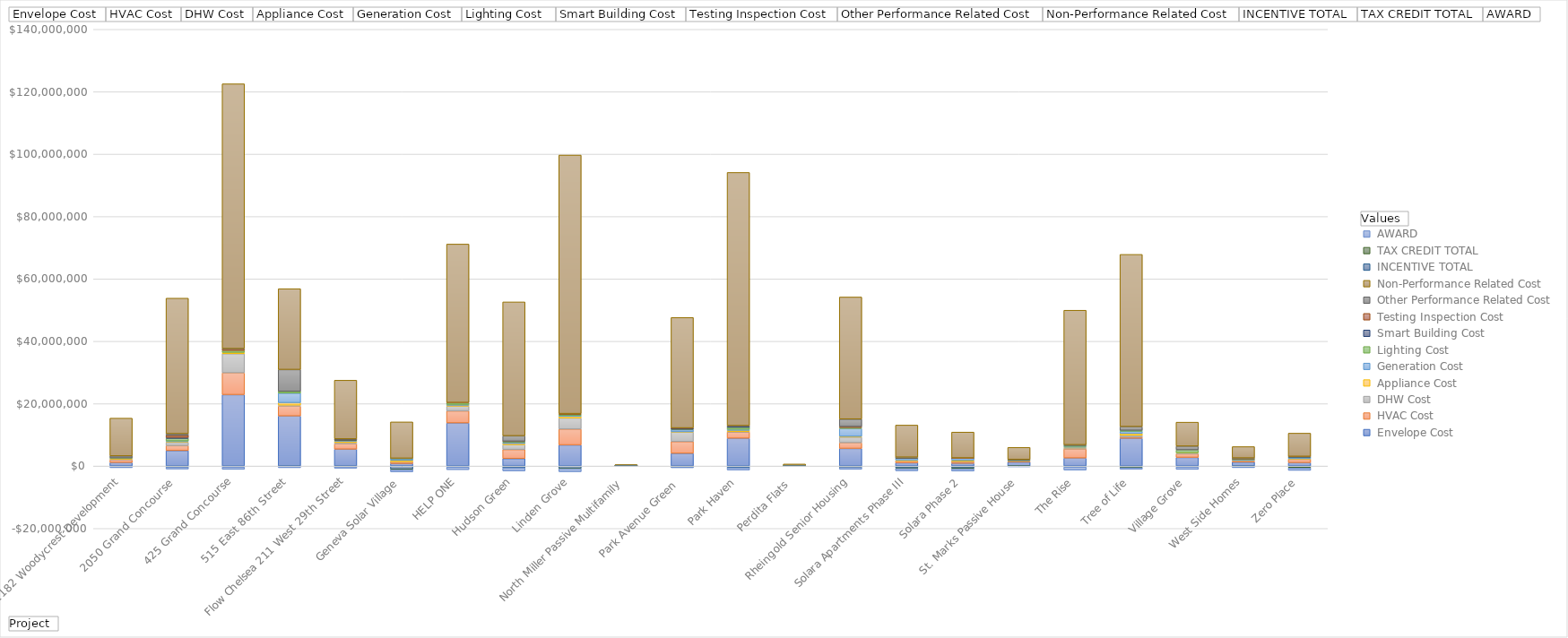
| Category |  Envelope Cost |  HVAC Cost |  DHW Cost |  Appliance Cost |  Generation Cost |  Lighting Cost  |  Smart Building Cost |  Testing Inspection Cost |  Other Performance Related Cost |  Non-Performance Related Cost |  INCENTIVE TOTAL |  TAX CREDIT TOTAL |  AWARD |
|---|---|---|---|---|---|---|---|---|---|---|---|---|---|
| 1182 Woodycrest Development | 1130801.59 | 879051 | 240000 | 140736 | 0 | 200000 | 0 | 0 | 645948 | 12128463.81 | -169700 | 0 | -350931 |
| 2050 Grand Concourse  | 4961040.213 | 1592848.164 | 1059435.67 | 183414 | 254596.04 | 807248.033 | 325541.73 | 689125 | 502235.25 | 43449917.157 | -235624 | -55599 | -647500 |
| 425 Grand Concourse | 22898351.84 | 6998906 | 6106206 | 434701 | 0 | 617156 | 0 | 546700 | 50300 | 84887679.16 | -300000 | 0 | -750000 |
| 515 East 86th Street  | 16052777 | 3168000 | 307000 | 788116 | 3072683 | 553272 | 0 | 0 | 7001039.706 | 25917381.706 | -99617.8 | 0 | -425000 |
| Flow Chelsea 211 West 29th Street | 5414207.77 | 1755748.5 | 356582 | 462963.94 | 157000 | 246715.67 | 50000 | 53050 | 198249.76 | 18820784.21 | -145660 | -49394 | -500000 |
| Geneva Solar Village | 823994 | 520783 | 73950 | 410325 | 571158 | 41511 | 0 | 0 | 64637.931 | 11648847 | -978000 | -140885 | -727236 |
| HELP ONE | 13820490 | 3860000 | 1521600 | 291269 | 263398 | 468693 | 0 | 142906 | 0 | 50797762.19 | -300000 | 0 | -850000 |
| Hudson Green | 2407694.931 | 2900092.81 | 1545000 | 374147 | 411400 | 281632.424 | 0 | 37000 | 1742800 | 42929555.668 | -555000 | 0 | -1000000 |
| Linden Grove | 6779865.441 | 5074592.04 | 3559889.291 | 572717.547 | 232500 | 400000 | 0 | 189900 | 0 | 82895592.98 | -700000 | -100000 | -1000000 |
| North Miller Passive Multifamily | 96977.91 | 8539.65 | 5400 | 7000 | 27815 | 2147.13 | 2300 | 7650 | 5000 | 289777.66 | -12600 | -14255 | -39467 |
| Park Avenue Green  | 4079691.16 | 3770484.94 | 3048214.42 | 63526 | 682830 | 141119.7 | 365000 | 73675 | 0 | 35399236.42 | -270600 | -20400 | -250000 |
| Park Haven | 8918168 | 2028100 | 91500 | 404336 | 339261 | 639515.63 | 403739.06 | 45775 | 100000 | 81164882.15 | -508200 | 0 | -750000 |
| Perdita Flats  | 64925.8 | 30000 | 12400 | 21000 | 34600 | 750 | 0 | 0 | 0 | 500484.2 | -6400 | -14933 | -59976 |
| Rheingold Senior Housing | 5651719.02 | 1830400 | 1791250 | 239216.96 | 2535918.75 | 294500 | 0 | 310000 | 2405000 | 39136690.99 | -339240 | -52250 | -637500 |
| Solara Apartments Phase III | 1057815 | 575523 | 60000 | 233256 | 678000 | 51000 | 45000 | 22372 | 131321 | 10287092 | -558250 | -199800 | -750000 |
| Solara Phase 2 | 884237 | 575523 | 60000 | 299400 | 678000 | 51000 | 45000 | 20826 | 0 | 8280460 | -571050 | -283035 | -750000 |
| St. Marks Passive House | 1286500 | 275000 | 105000 | 120000 | 40000 | 80000 | 0 | 0 | 186730 | 3887850 | -13608 | -29906 | -203082 |
| The Rise | 2579052 | 2922400 | 300000 | 212800 | 273845 | 280000 | 0 | 0 | 260966 | 43128939.45 | -279680 | 0 | -1000000 |
| Tree of Life | 8908493.25 | 366127.83 | 575000 | 625000 | 679194.51 | 300000 | 0 | 0 | 1195947.3 | 55205071.24 | -320000 | -185526 | -500000 |
| Village Grove | 2770500 | 1174200 | 320280 | 30642.95 | 0 | 888684 | 0 | 0 | 1189475 | 7697481.89 | -274000 | 0 | -792438 |
| West Side Homes | 1283405.21 | 415414.84 | 213378.98 | 32298.56 | 119136.74 | 301510.08 | 0 | 500 | 224844.694 | 3646134.94 | -115819 | -27878 | -362620 |
| Zero Place | 1101500 | 1100000 | 50000 | 110630 | 475000 | 10000 | 215000 | 45000 | 0 | 7440183 | -315040 | -313400 | -750000 |